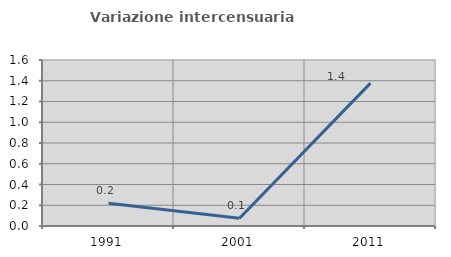
| Category | Variazione intercensuaria annua |
|---|---|
| 1991.0 | 0.22 |
| 2001.0 | 0.075 |
| 2011.0 | 1.377 |